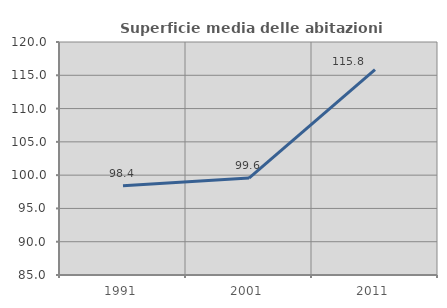
| Category | Superficie media delle abitazioni occupate |
|---|---|
| 1991.0 | 98.412 |
| 2001.0 | 99.567 |
| 2011.0 | 115.838 |